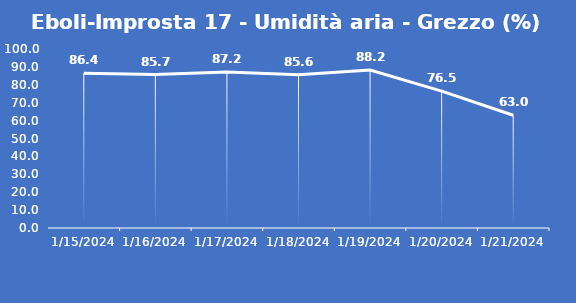
| Category | Eboli-Improsta 17 - Umidità aria - Grezzo (%) |
|---|---|
| 1/15/24 | 86.4 |
| 1/16/24 | 85.7 |
| 1/17/24 | 87.2 |
| 1/18/24 | 85.6 |
| 1/19/24 | 88.2 |
| 1/20/24 | 76.5 |
| 1/21/24 | 63 |